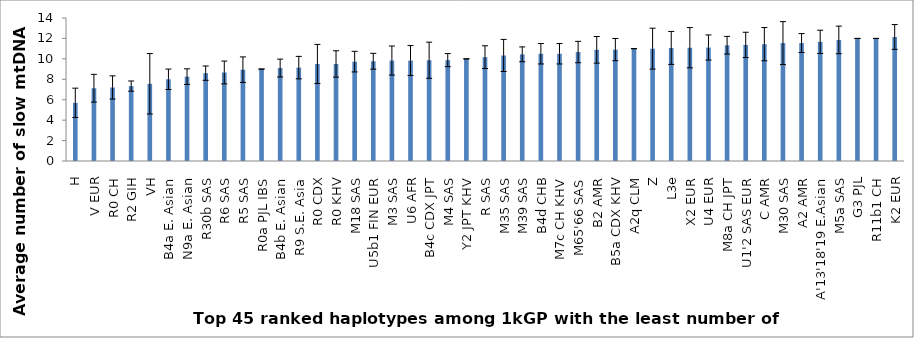
| Category | Slow average # |
|---|---|
| H | 5.696 |
| V EUR | 7.125 |
| R0 CH | 7.2 |
| R2 GIH | 7.333 |
| VH | 7.561 |
| B4a E. Asian | 8 |
| N9a E. Asian | 8.259 |
| R30b SAS | 8.6 |
| R6 SAS | 8.667 |
| R5 SAS | 8.941 |
| R0a PJL IBS | 9 |
| B4b E. Asian | 9.1 |
| R9 S.E. Asia | 9.143 |
| R0 CDX | 9.5 |
| R0 KHV | 9.5 |
| M18 SAS | 9.727 |
| U5b1 FIN EUR | 9.767 |
| M3 SAS | 9.833 |
| U6 AFR | 9.833 |
| B4c CDX JPT | 9.867 |
| M4 SAS | 9.875 |
| Y2 JPT KHV | 10 |
| R SAS | 10.167 |
| M35 SAS | 10.333 |
| M39 SAS | 10.444 |
| B4d CHB | 10.5 |
| M7c CH KHV | 10.5 |
| M65'66 SAS | 10.667 |
| B2 AMR | 10.884 |
| B5a CDX KHV | 10.906 |
| A2q CLM | 11 |
| Z | 11 |
| L3e | 11.071 |
| X2 EUR | 11.091 |
| U4 EUR | 11.111 |
| M8a CH JPT | 11.333 |
| U1'2 SAS EUR | 11.367 |
| C AMR | 11.439 |
| M30 SAS | 11.542 |
| A2 AMR | 11.548 |
| A'13'18'19 E.Asian | 11.667 |
| M5a SAS | 11.854 |
| G3 PJL | 12 |
| R11b1 CH | 12 |
| K2 EUR | 12.143 |